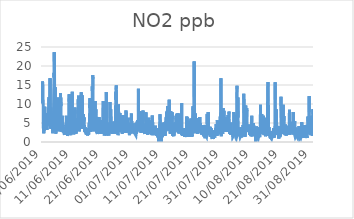
| Category | NO2 |
|---|---|
| 01/06/2019 | 15.1 |
| 01/06/2019 | 10.2 |
| 01/06/2019 | 10.1 |
| 01/06/2019 | 10.1 |
| 01/06/2019 | 15.9 |
| 01/06/2019 | 15.6 |
| 01/06/2019 | 15.8 |
| 01/06/2019 | 15 |
| 01/06/2019 | 13.9 |
| 01/06/2019 | 9.8 |
| 01/06/2019 | 4.7 |
| 01/06/2019 | 3 |
| 01/06/2019 | 3.1 |
| 01/06/2019 | 3.5 |
| 01/06/2019 | 2.3 |
| 01/06/2019 | 3.7 |
| 01/06/2019 | 3 |
| 01/06/2019 | 3.1 |
| 01/06/2019 | 4.1 |
| 01/06/2019 | 6.6 |
| 01/06/2019 | 7.6 |
| 01/06/2019 | 6.5 |
| 01/06/2019 | 9.3 |
| 01/06/2019 | 5.9 |
| 02/06/2019 | 5.3 |
| 02/06/2019 | 7.2 |
| 02/06/2019 | 6.7 |
| 02/06/2019 | 5.6 |
| 02/06/2019 | 5.7 |
| 02/06/2019 | 5.6 |
| 02/06/2019 | 5.4 |
| 02/06/2019 | 4.9 |
| 02/06/2019 | 4.8 |
| 02/06/2019 | 6.1 |
| 02/06/2019 | 7.6 |
| 02/06/2019 | 5.3 |
| 02/06/2019 | 4.1 |
| 02/06/2019 | 4.3 |
| 02/06/2019 | 4.6 |
| 02/06/2019 | 3.2 |
| 02/06/2019 | 3.7 |
| 02/06/2019 | 3.7 |
| 02/06/2019 | 3.8 |
| 02/06/2019 | 3.9 |
| 02/06/2019 | 4.5 |
| 02/06/2019 | 6.1 |
| 02/06/2019 | 5.2 |
| 02/06/2019 | 5.2 |
| 03/06/2019 | 6.2 |
| 03/06/2019 | 6.6 |
| 03/06/2019 | 7.2 |
| 03/06/2019 | 7.5 |
| 03/06/2019 | 7.7 |
| 03/06/2019 | 8.7 |
| 03/06/2019 | 8.8 |
| 03/06/2019 | 11 |
| 03/06/2019 | 11.8 |
| 03/06/2019 | 7.6 |
| 03/06/2019 | 7.6 |
| 03/06/2019 | 4.8 |
| 03/06/2019 | 5.6 |
| 03/06/2019 | 9.8 |
| 03/06/2019 | 5 |
| 03/06/2019 | 6.8 |
| 03/06/2019 | 5.8 |
| 03/06/2019 | 16.8 |
| 03/06/2019 | 8 |
| 03/06/2019 | 3.6 |
| 03/06/2019 | 4 |
| 03/06/2019 | 5.7 |
| 03/06/2019 | 5.2 |
| 03/06/2019 | 9.1 |
| 04/06/2019 | 3.5 |
| 04/06/2019 | 4.2 |
| 04/06/2019 | 6.6 |
| 04/06/2019 | 6.5 |
| 04/06/2019 | 7.6 |
| 04/06/2019 | 6.5 |
| 04/06/2019 | 6 |
| 04/06/2019 | 5.8 |
| 04/06/2019 | 4.9 |
| 04/06/2019 | 4.1 |
| 04/06/2019 | 4.2 |
| 04/06/2019 | 3.6 |
| 04/06/2019 | 4.6 |
| 04/06/2019 | 2.8 |
| 04/06/2019 | 2.3 |
| 04/06/2019 | 2.8 |
| 04/06/2019 | 2.6 |
| 04/06/2019 | 3.1 |
| 04/06/2019 | 2.7 |
| 04/06/2019 | 3.8 |
| 04/06/2019 | 5.3 |
| 04/06/2019 | 7.8 |
| 04/06/2019 | 11.2 |
| 04/06/2019 | 13.8 |
| 05/06/2019 | 14.8 |
| 05/06/2019 | 18.2 |
| 05/06/2019 | 17 |
| 05/06/2019 | 23.6 |
| 05/06/2019 | 21.1 |
| 05/06/2019 | 19.2 |
| 05/06/2019 | 12.4 |
| 05/06/2019 | 7.4 |
| 05/06/2019 | 5.9 |
| 05/06/2019 | 5.8 |
| 05/06/2019 | 4.3 |
| 05/06/2019 | 14.4 |
| 05/06/2019 | 7.2 |
| 05/06/2019 | 3 |
| 05/06/2019 | 4.4 |
| 05/06/2019 | 3.2 |
| 05/06/2019 | 2.2 |
| 05/06/2019 | 2.1 |
| 05/06/2019 | 3.5 |
| 05/06/2019 | 2.9 |
| 05/06/2019 | 4.5 |
| 05/06/2019 | 6.8 |
| 05/06/2019 | 6.2 |
| 05/06/2019 | 6.6 |
| 06/06/2019 | 6.8 |
| 06/06/2019 | 7.1 |
| 06/06/2019 | 6.1 |
| 06/06/2019 | 6.9 |
| 06/06/2019 | 10.6 |
| 06/06/2019 | 11.7 |
| 06/06/2019 | 10 |
| 06/06/2019 | 6.7 |
| 06/06/2019 | 4.2 |
| 06/06/2019 | 4.2 |
| 06/06/2019 | 4.9 |
| 06/06/2019 | 3.9 |
| 06/06/2019 | 4.3 |
| 06/06/2019 | 4.4 |
| 06/06/2019 | 3.5 |
| 06/06/2019 | 3.1 |
| 06/06/2019 | 3.1 |
| 06/06/2019 | 2.8 |
| 06/06/2019 | 2.6 |
| 06/06/2019 | 2.8 |
| 06/06/2019 | 3.7 |
| 06/06/2019 | 5 |
| 06/06/2019 | 6.8 |
| 06/06/2019 | 8.1 |
| 07/06/2019 | 7.7 |
| 07/06/2019 | 6.2 |
| 07/06/2019 | 5.2 |
| 07/06/2019 | 6.6 |
| 07/06/2019 | 7.1 |
| 07/06/2019 | 10.5 |
| 07/06/2019 | 12.9 |
| 07/06/2019 | 9.6 |
| 07/06/2019 | 11.7 |
| 07/06/2019 | 9.4 |
| 07/06/2019 | 6.7 |
| 07/06/2019 | 5.1 |
| 07/06/2019 | 4 |
| 07/06/2019 | 3.7 |
| 07/06/2019 | 3 |
| 07/06/2019 | 2.7 |
| 07/06/2019 | 3 |
| 07/06/2019 | 2.9 |
| 07/06/2019 | 3.1 |
| 07/06/2019 | 3.7 |
| 07/06/2019 | 6.9 |
| 07/06/2019 | 5.1 |
| 07/06/2019 | 4.9 |
| 07/06/2019 | 2.9 |
| 08/06/2019 | 3.3 |
| 08/06/2019 | 3.6 |
| 08/06/2019 | 3.3 |
| 08/06/2019 | 3.8 |
| 08/06/2019 | 2.9 |
| 08/06/2019 | 2.5 |
| 08/06/2019 | 2.5 |
| 08/06/2019 | 2.6 |
| 08/06/2019 | 3.7 |
| 08/06/2019 | 3.2 |
| 08/06/2019 | 2.2 |
| 08/06/2019 | 2.1 |
| 08/06/2019 | 2.3 |
| 08/06/2019 | 2.1 |
| 08/06/2019 | 1.9 |
| 08/06/2019 | 2.2 |
| 08/06/2019 | 2.3 |
| 08/06/2019 | 2.2 |
| 08/06/2019 | 2.4 |
| 08/06/2019 | 2.2 |
| 08/06/2019 | 2.1 |
| 08/06/2019 | 2.2 |
| 08/06/2019 | 3.2 |
| 08/06/2019 | 3 |
| 09/06/2019 | 4.5 |
| 09/06/2019 | 4.1 |
| 09/06/2019 | 3.9 |
| 09/06/2019 | 4.9 |
| 09/06/2019 | 6 |
| 09/06/2019 | 6.9 |
| 09/06/2019 | 6.4 |
| 09/06/2019 | 5.5 |
| 09/06/2019 | 4.1 |
| 09/06/2019 | 3.6 |
| 09/06/2019 | 2.9 |
| 09/06/2019 | 3.1 |
| 09/06/2019 | 2.7 |
| 09/06/2019 | 2.6 |
| 09/06/2019 | 2.1 |
| 09/06/2019 | 1.6 |
| 09/06/2019 | 1.7 |
| 09/06/2019 | 1.6 |
| 09/06/2019 | 1.5 |
| 09/06/2019 | 1.7 |
| 09/06/2019 | 2.5 |
| 09/06/2019 | 3.9 |
| 09/06/2019 | 6.4 |
| 09/06/2019 | 5.4 |
| 10/06/2019 | 6.3 |
| 10/06/2019 | 8.7 |
| 10/06/2019 | 11.1 |
| 10/06/2019 | 12.2 |
| 10/06/2019 | 12.6 |
| 10/06/2019 | 10.6 |
| 10/06/2019 | 11.7 |
| 10/06/2019 | 9.1 |
| 10/06/2019 | 6.6 |
| 10/06/2019 | 11 |
| 10/06/2019 | 6 |
| 10/06/2019 | 3.4 |
| 10/06/2019 | 2.5 |
| 10/06/2019 | 3.7 |
| 10/06/2019 | 2.4 |
| 10/06/2019 | 2.5 |
| 10/06/2019 | 2.1 |
| 10/06/2019 | 1.8 |
| 10/06/2019 | 1.9 |
| 10/06/2019 | 3.3 |
| 10/06/2019 | 4.9 |
| 10/06/2019 | 3.5 |
| 10/06/2019 | 3.7 |
| 10/06/2019 | 3.6 |
| 11/06/2019 | 3.7 |
| 11/06/2019 | 8.2 |
| 11/06/2019 | 8.6 |
| 11/06/2019 | 6.2 |
| 11/06/2019 | 9.3 |
| 11/06/2019 | 13.2 |
| 11/06/2019 | 8.3 |
| 11/06/2019 | 7.6 |
| 11/06/2019 | 5 |
| 11/06/2019 | 4.6 |
| 11/06/2019 | 3.7 |
| 11/06/2019 | 3.4 |
| 11/06/2019 | 2.5 |
| 11/06/2019 | 2.9 |
| 11/06/2019 | 2.8 |
| 11/06/2019 | 2.4 |
| 11/06/2019 | 2.6 |
| 11/06/2019 | 2 |
| 11/06/2019 | 2.3 |
| 11/06/2019 | 2.7 |
| 11/06/2019 | 3.3 |
| 11/06/2019 | 4.9 |
| 11/06/2019 | 5.4 |
| 11/06/2019 | 5.2 |
| 12/06/2019 | 6.1 |
| 12/06/2019 | 6.7 |
| 12/06/2019 | 6.5 |
| 12/06/2019 | 7.9 |
| 12/06/2019 | 9.1 |
| 12/06/2019 | 7.4 |
| 12/06/2019 | 6.5 |
| 12/06/2019 | 6.1 |
| 12/06/2019 | 5.9 |
| 12/06/2019 | 4.2 |
| 12/06/2019 | 2.8 |
| 12/06/2019 | 3.2 |
| 12/06/2019 | 2.2 |
| 12/06/2019 | 3.9 |
| 12/06/2019 | 2.6 |
| 12/06/2019 | 4.3 |
| 12/06/2019 | 3 |
| 12/06/2019 | 4.9 |
| 12/06/2019 | 3.7 |
| 12/06/2019 | 3.9 |
| 12/06/2019 | 4.2 |
| 12/06/2019 | 4.3 |
| 12/06/2019 | 5.3 |
| 12/06/2019 | 3.9 |
| 13/06/2019 | 4.9 |
| 13/06/2019 | 5.1 |
| 13/06/2019 | 5 |
| 13/06/2019 | 8 |
| 13/06/2019 | 9.8 |
| 13/06/2019 | 11.3 |
| 13/06/2019 | 11 |
| 13/06/2019 | 9.7 |
| 13/06/2019 | 12.2 |
| 13/06/2019 | 11.8 |
| 13/06/2019 | 6.6 |
| 13/06/2019 | 8.4 |
| 13/06/2019 | 8.2 |
| 13/06/2019 | 2.8 |
| 13/06/2019 | 2.7 |
| 13/06/2019 | 2.7 |
| 13/06/2019 | 2.6 |
| 13/06/2019 | 3.5 |
| 13/06/2019 | 3.6 |
| 13/06/2019 | 3.8 |
| 13/06/2019 | 3.9 |
| 13/06/2019 | 5.1 |
| 13/06/2019 | 6 |
| 13/06/2019 | 7.3 |
| 14/06/2019 | 3.5 |
| 14/06/2019 | 4.2 |
| 14/06/2019 | 5.5 |
| 14/06/2019 | 5.6 |
| 14/06/2019 | 7.5 |
| 14/06/2019 | 11.8 |
| 14/06/2019 | 13.1 |
| 14/06/2019 | 10.7 |
| 14/06/2019 | 7.7 |
| 14/06/2019 | 7.3 |
| 14/06/2019 | 5 |
| 14/06/2019 | 10.5 |
| 14/06/2019 | 7.1 |
| 14/06/2019 | 8.1 |
| 14/06/2019 | 12.3 |
| 14/06/2019 | 8 |
| 14/06/2019 | 5.2 |
| 14/06/2019 | 6 |
| 14/06/2019 | 6.7 |
| 14/06/2019 | 4.9 |
| 14/06/2019 | 3.4 |
| 14/06/2019 | 4.2 |
| 14/06/2019 | 3.9 |
| 14/06/2019 | 4.6 |
| 15/06/2019 | 7.3 |
| 15/06/2019 | 5.1 |
| 15/06/2019 | 6.6 |
| 15/06/2019 | 5.4 |
| 15/06/2019 | 6.4 |
| 15/06/2019 | 4.6 |
| 15/06/2019 | 3.8 |
| 15/06/2019 | 4.5 |
| 15/06/2019 | 4.2 |
| 15/06/2019 | 3 |
| 15/06/2019 | 2.6 |
| 15/06/2019 | 2.8 |
| 15/06/2019 | 3.5 |
| 15/06/2019 | 3.7 |
| 15/06/2019 | 3.9 |
| 15/06/2019 | 3.2 |
| 15/06/2019 | 3.2 |
| 15/06/2019 | 3.1 |
| 15/06/2019 | 2.9 |
| 15/06/2019 | 2.4 |
| 15/06/2019 | 2.5 |
| 15/06/2019 | 3.1 |
| 15/06/2019 | 2 |
| 15/06/2019 | 2 |
| 16/06/2019 | 3.6 |
| 16/06/2019 | 3.1 |
| 16/06/2019 | 3.1 |
| 16/06/2019 | 2 |
| 16/06/2019 | 3.2 |
| 16/06/2019 | 3.3 |
| 16/06/2019 | 3.5 |
| 16/06/2019 | 2.1 |
| 16/06/2019 | 2.1 |
| 16/06/2019 | 1.7 |
| 16/06/2019 | 1.8 |
| 16/06/2019 | 2 |
| 16/06/2019 | 2.4 |
| 16/06/2019 | 2 |
| 16/06/2019 | 2.2 |
| 16/06/2019 | 2.2 |
| 16/06/2019 | 2.1 |
| 16/06/2019 | 2.4 |
| 16/06/2019 | 2 |
| 16/06/2019 | 2.1 |
| 16/06/2019 | 2.6 |
| 16/06/2019 | 4 |
| 16/06/2019 | 4 |
| 16/06/2019 | 5.1 |
| 17/06/2019 | 3.8 |
| 17/06/2019 | 5 |
| 17/06/2019 | 7.1 |
| 17/06/2019 | 9.9 |
| 17/06/2019 | 9 |
| 17/06/2019 | 11.5 |
| 17/06/2019 | 9.5 |
| 17/06/2019 | 6.5 |
| 17/06/2019 | 5.3 |
| 17/06/2019 | 3.5 |
| 17/06/2019 | 2.8 |
| 17/06/2019 | 3.3 |
| 17/06/2019 | 3.2 |
| 17/06/2019 | 2.7 |
| 17/06/2019 | 2.6 |
| 17/06/2019 | 2.8 |
| 17/06/2019 | 4.8 |
| 17/06/2019 | 3.6 |
| 17/06/2019 | 3.3 |
| 17/06/2019 | 3.8 |
| 17/06/2019 | 3.1 |
| 17/06/2019 | 3.7 |
| 17/06/2019 | 8.6 |
| 17/06/2019 | 10.3 |
| 18/06/2019 | 14.7 |
| 18/06/2019 | 11.9 |
| 18/06/2019 | 13.5 |
| 18/06/2019 | 14.2 |
| 18/06/2019 | 17.6 |
| 18/06/2019 | 16.6 |
| 18/06/2019 | 13.7 |
| 18/06/2019 | 7.3 |
| 18/06/2019 | 6.3 |
| 18/06/2019 | 5.6 |
| 18/06/2019 | 5.6 |
| 18/06/2019 | 4.7 |
| 18/06/2019 | 3.1 |
| 18/06/2019 | 5 |
| 18/06/2019 | 4.2 |
| 18/06/2019 | 3.5 |
| 18/06/2019 | 3.4 |
| 18/06/2019 | 3.3 |
| 18/06/2019 | 3.8 |
| 18/06/2019 | 2.8 |
| 18/06/2019 | 3.1 |
| 18/06/2019 | 8.8 |
| 18/06/2019 | 9.2 |
| 18/06/2019 | 10.8 |
| 19/06/2019 | 8.3 |
| 19/06/2019 | 7 |
| 19/06/2019 | 7.3 |
| 19/06/2019 | 7.6 |
| 19/06/2019 | 8.2 |
| 19/06/2019 | 8.6 |
| 19/06/2019 | 8.4 |
| 19/06/2019 | 7.3 |
| 19/06/2019 | 6.6 |
| 19/06/2019 | 4.1 |
| 19/06/2019 | 3.8 |
| 19/06/2019 | 2.9 |
| 19/06/2019 | 2.8 |
| 19/06/2019 | 2.5 |
| 19/06/2019 | 3.8 |
| 19/06/2019 | 2.4 |
| 19/06/2019 | 2.1 |
| 19/06/2019 | 2.4 |
| 19/06/2019 | 2.1 |
| 19/06/2019 | 2.2 |
| 19/06/2019 | 4.1 |
| 19/06/2019 | 3.9 |
| 19/06/2019 | 3.8 |
| 19/06/2019 | 3.9 |
| 20/06/2019 | 5 |
| 20/06/2019 | 5.6 |
| 20/06/2019 | 5.4 |
| 20/06/2019 | 5.6 |
| 20/06/2019 | 6.6 |
| 20/06/2019 | 5 |
| 20/06/2019 | 6.5 |
| 20/06/2019 | 5.5 |
| 20/06/2019 | 4.1 |
| 20/06/2019 | 3 |
| 20/06/2019 | 2.5 |
| 20/06/2019 | 2.8 |
| 20/06/2019 | 2.6 |
| 20/06/2019 | 2.5 |
| 20/06/2019 | 3.1 |
| 20/06/2019 | 3.4 |
| 20/06/2019 | 2.1 |
| 20/06/2019 | 2.6 |
| 20/06/2019 | 4.9 |
| 20/06/2019 | 4.6 |
| 20/06/2019 | 4.7 |
| 20/06/2019 | 5.8 |
| 20/06/2019 | 4.8 |
| 20/06/2019 | 4.8 |
| 21/06/2019 | 2.8 |
| 21/06/2019 | 2.7 |
| 21/06/2019 | 3.2 |
| 21/06/2019 | 2.2 |
| 21/06/2019 | 2.5 |
| 21/06/2019 | 3 |
| 21/06/2019 | 3.2 |
| 21/06/2019 | 5.1 |
| 21/06/2019 | 4.6 |
| 21/06/2019 | 3.8 |
| 21/06/2019 | 3.2 |
| 21/06/2019 | 3.5 |
| 21/06/2019 | 3.2 |
| 21/06/2019 | 3.6 |
| 21/06/2019 | 3.8 |
| 21/06/2019 | 4.1 |
| 21/06/2019 | 10.8 |
| 21/06/2019 | 3.3 |
| 21/06/2019 | 4.2 |
| 21/06/2019 | 2.8 |
| 21/06/2019 | 3.7 |
| 21/06/2019 | 3.6 |
| 21/06/2019 | 2.5 |
| 21/06/2019 | 2.6 |
| 22/06/2019 | 2 |
| 22/06/2019 | 1.7 |
| 22/06/2019 | 1.8 |
| 22/06/2019 | 1.8 |
| 22/06/2019 | 1.7 |
| 22/06/2019 | 1.9 |
| 22/06/2019 | 1.8 |
| 22/06/2019 | 2.5 |
| 22/06/2019 | 2 |
| 22/06/2019 | 2.4 |
| 22/06/2019 | 5.6 |
| 22/06/2019 | 4.5 |
| 22/06/2019 | 3.3 |
| 22/06/2019 | 4.4 |
| 22/06/2019 | 9.2 |
| 22/06/2019 | 3.9 |
| 22/06/2019 | 10.5 |
| 22/06/2019 | 10.1 |
| 22/06/2019 | 13.1 |
| 22/06/2019 | 11.1 |
| 22/06/2019 | 1.7 |
| 22/06/2019 | 2.2 |
| 22/06/2019 | 2.2 |
| 22/06/2019 | 2.4 |
| 23/06/2019 | 2.5 |
| 23/06/2019 | 2.2 |
| 23/06/2019 | 2.1 |
| 23/06/2019 | 2.4 |
| 23/06/2019 | 2.7 |
| 23/06/2019 | 2.5 |
| 23/06/2019 | 2.3 |
| 23/06/2019 | 2.2 |
| 23/06/2019 | 2.2 |
| 23/06/2019 | 2.2 |
| 23/06/2019 | 2.2 |
| 23/06/2019 | 2.4 |
| 23/06/2019 | 2 |
| 23/06/2019 | 1.9 |
| 23/06/2019 | 1.7 |
| 23/06/2019 | 2 |
| 23/06/2019 | 3.3 |
| 23/06/2019 | 2.3 |
| 23/06/2019 | 3.1 |
| 23/06/2019 | 2.8 |
| 23/06/2019 | 4.3 |
| 23/06/2019 | 6.1 |
| 23/06/2019 | 7.2 |
| 23/06/2019 | 9.3 |
| 24/06/2019 | 10.5 |
| 24/06/2019 | 6.3 |
| 24/06/2019 | 5.2 |
| 24/06/2019 | 5 |
| 24/06/2019 | 3.8 |
| 24/06/2019 | 5.6 |
| 24/06/2019 | 8.6 |
| 24/06/2019 | 5.6 |
| 24/06/2019 | 4.5 |
| 24/06/2019 | 4.5 |
| 24/06/2019 | 4.7 |
| 24/06/2019 | 4 |
| 24/06/2019 | 3.6 |
| 24/06/2019 | 2.9 |
| 24/06/2019 | 3.7 |
| 24/06/2019 | 3.3 |
| 24/06/2019 | 2.2 |
| 24/06/2019 | 2.2 |
| 24/06/2019 | 2.8 |
| 24/06/2019 | 2.2 |
| 24/06/2019 | 2.2 |
| 24/06/2019 | 2.7 |
| 24/06/2019 | 3.2 |
| 24/06/2019 | 4 |
| 25/06/2019 | 3.2 |
| 25/06/2019 | 3.6 |
| 25/06/2019 | 2.5 |
| 25/06/2019 | 2.5 |
| 25/06/2019 | 2.6 |
| 25/06/2019 | 3.2 |
| 25/06/2019 | 5.4 |
| 25/06/2019 | 2.7 |
| 25/06/2019 | 2.9 |
| 25/06/2019 | 3 |
| 25/06/2019 | 3.1 |
| 25/06/2019 | 3.2 |
| 25/06/2019 | 2.3 |
| 25/06/2019 | 2.5 |
| 25/06/2019 | 3.8 |
| 25/06/2019 | 2.7 |
| 25/06/2019 | 2.2 |
| 25/06/2019 | 2 |
| 25/06/2019 | 2 |
| 25/06/2019 | 2.6 |
| 25/06/2019 | 2.9 |
| 25/06/2019 | 8.7 |
| 25/06/2019 | 13.2 |
| 25/06/2019 | 11.2 |
| 26/06/2019 | 12.1 |
| 26/06/2019 | 14.1 |
| 26/06/2019 | 14.9 |
| 26/06/2019 | 14 |
| 26/06/2019 | 12.9 |
| 26/06/2019 | 10.1 |
| 26/06/2019 | 9.9 |
| 26/06/2019 | 7.8 |
| 26/06/2019 | 8.5 |
| 26/06/2019 | 5.2 |
| 26/06/2019 | 3.1 |
| 26/06/2019 | 2.6 |
| 26/06/2019 | 2.5 |
| 26/06/2019 | 2.8 |
| 26/06/2019 | 2.5 |
| 26/06/2019 | 2.3 |
| 26/06/2019 | 1.8 |
| 26/06/2019 | 1.8 |
| 26/06/2019 | 2.1 |
| 26/06/2019 | 3.9 |
| 26/06/2019 | 5 |
| 26/06/2019 | 9.9 |
| 26/06/2019 | 6.3 |
| 26/06/2019 | 6.2 |
| 27/06/2019 | 5.7 |
| 27/06/2019 | 3.3 |
| 27/06/2019 | 2.6 |
| 27/06/2019 | 3 |
| 27/06/2019 | 3.9 |
| 27/06/2019 | 4.4 |
| 27/06/2019 | 6.2 |
| 27/06/2019 | 6 |
| 27/06/2019 | 7.6 |
| 27/06/2019 | 5.3 |
| 27/06/2019 | 5.6 |
| 27/06/2019 | 4.3 |
| 27/06/2019 | 6.4 |
| 27/06/2019 | 4 |
| 27/06/2019 | 4.6 |
| 27/06/2019 | 4.8 |
| 27/06/2019 | 3.9 |
| 27/06/2019 | 3.4 |
| 27/06/2019 | 2.9 |
| 27/06/2019 | 4.1 |
| 27/06/2019 | 4.1 |
| 27/06/2019 | 5.2 |
| 27/06/2019 | 3.5 |
| 27/06/2019 | 2.6 |
| 28/06/2019 | 4.4 |
| 28/06/2019 | 4.9 |
| 28/06/2019 | 4.8 |
| 28/06/2019 | 2.2 |
| 28/06/2019 | 3.1 |
| 28/06/2019 | 5.3 |
| 28/06/2019 | 6.2 |
| 28/06/2019 | 5.5 |
| 28/06/2019 | 5.4 |
| 28/06/2019 | 7.1 |
| 28/06/2019 | 3.9 |
| 28/06/2019 | 5 |
| 28/06/2019 | 4.3 |
| 28/06/2019 | 3.6 |
| 28/06/2019 | 4.1 |
| 28/06/2019 | 5.4 |
| 28/06/2019 | 4.6 |
| 28/06/2019 | 3.5 |
| 28/06/2019 | 4.3 |
| 28/06/2019 | 3.2 |
| 28/06/2019 | 4.6 |
| 28/06/2019 | 5.1 |
| 28/06/2019 | 4.2 |
| 28/06/2019 | 4.5 |
| 29/06/2019 | 6.1 |
| 29/06/2019 | 6.3 |
| 29/06/2019 | 3.3 |
| 29/06/2019 | 2.4 |
| 29/06/2019 | 2.3 |
| 29/06/2019 | 4.4 |
| 29/06/2019 | 3.9 |
| 29/06/2019 | 4.4 |
| 29/06/2019 | 3.7 |
| 29/06/2019 | 7.9 |
| 29/06/2019 | 8.3 |
| 29/06/2019 | 7.1 |
| 29/06/2019 | 7.2 |
| 29/06/2019 | 4 |
| 29/06/2019 | 4.8 |
| 29/06/2019 | 5.8 |
| 29/06/2019 | 2.7 |
| 29/06/2019 | 3.1 |
| 29/06/2019 | 3 |
| 29/06/2019 | 2.5 |
| 29/06/2019 | 2.4 |
| 29/06/2019 | 3.1 |
| 29/06/2019 | 5.3 |
| 29/06/2019 | 5 |
| 30/06/2019 | 5.8 |
| 30/06/2019 | 5.7 |
| 30/06/2019 | 6.1 |
| 30/06/2019 | 6.4 |
| 30/06/2019 | 5.7 |
| 30/06/2019 | 4.9 |
| 30/06/2019 | 2.7 |
| 30/06/2019 | 2.6 |
| 30/06/2019 | 2.6 |
| 30/06/2019 | 3.2 |
| 30/06/2019 | 2.6 |
| 30/06/2019 | 2.2 |
| 30/06/2019 | 2 |
| 30/06/2019 | 2 |
| 30/06/2019 | 1.8 |
| 30/06/2019 | 1.6 |
| 30/06/2019 | 2.4 |
| 30/06/2019 | 2.2 |
| 30/06/2019 | 2.1 |
| 30/06/2019 | 3.6 |
| 30/06/2019 | 4.3 |
| 30/06/2019 | 4.5 |
| 30/06/2019 | 4.5 |
| 30/06/2019 | 3.3 |
| 01/07/2019 | 4.1 |
| 01/07/2019 | 3.3 |
| 01/07/2019 | 3.5 |
| 01/07/2019 | 4.3 |
| 01/07/2019 | 4.8 |
| 01/07/2019 | 7.5 |
| 01/07/2019 | 5.8 |
| 01/07/2019 | 5 |
| 01/07/2019 | 5.5 |
| 01/07/2019 | 4.1 |
| 01/07/2019 | 2.8 |
| 01/07/2019 | 2.4 |
| 01/07/2019 | 2.3 |
| 01/07/2019 | 3.2 |
| 01/07/2019 | 4.2 |
| 01/07/2019 | 4.2 |
| 01/07/2019 | 2.9 |
| 01/07/2019 | 2.4 |
| 01/07/2019 | 2.6 |
| 01/07/2019 | 3.4 |
| 01/07/2019 | 4.9 |
| 01/07/2019 | 2.9 |
| 01/07/2019 | 2.3 |
| 01/07/2019 | 2.2 |
| 02/07/2019 | 2.9 |
| 02/07/2019 | 3.6 |
| 02/07/2019 | 3.4 |
| 02/07/2019 | 3.5 |
| 02/07/2019 | 2.8 |
| 02/07/2019 | 2.1 |
| 02/07/2019 | 2.1 |
| 02/07/2019 | 3.8 |
| 02/07/2019 | 2.4 |
| 02/07/2019 | 2.2 |
| 02/07/2019 | 2.3 |
| 02/07/2019 | 2.1 |
| 02/07/2019 | 1.9 |
| 02/07/2019 | 1.9 |
| 02/07/2019 | 2 |
| 02/07/2019 | 2.1 |
| 02/07/2019 | 1.9 |
| 02/07/2019 | 1.9 |
| 02/07/2019 | 1.7 |
| 02/07/2019 | 2 |
| 02/07/2019 | 2.3 |
| 02/07/2019 | 5.1 |
| 02/07/2019 | 4.3 |
| 02/07/2019 | 2.2 |
| 03/07/2019 | 2.1 |
| 03/07/2019 | 2.9 |
| 03/07/2019 | 4.7 |
| 03/07/2019 | 3.9 |
| 03/07/2019 | 3.2 |
| 03/07/2019 | 3 |
| 03/07/2019 | 5.8 |
| 03/07/2019 | 4.8 |
| 03/07/2019 | 4.8 |
| 03/07/2019 | 3.9 |
| 03/07/2019 | 3 |
| 03/07/2019 | 3.5 |
| 03/07/2019 | 2.8 |
| 03/07/2019 | 4.9 |
| 03/07/2019 | 14 |
| 03/07/2019 | 5.4 |
| 03/07/2019 | 4.9 |
| 03/07/2019 | 4.5 |
| 03/07/2019 | 7.7 |
| 03/07/2019 | 3.1 |
| 03/07/2019 | 3.2 |
| 03/07/2019 | 4 |
| 03/07/2019 | 3.1 |
| 03/07/2019 | 4 |
| 04/07/2019 | 4.2 |
| 04/07/2019 | 3.9 |
| 04/07/2019 | 3.6 |
| 04/07/2019 | 3 |
| 04/07/2019 | 4 |
| 04/07/2019 | 7 |
| 04/07/2019 | 8.1 |
| 04/07/2019 | 5.5 |
| 04/07/2019 | 4.6 |
| 04/07/2019 | 5.1 |
| 04/07/2019 | 3.5 |
| 04/07/2019 | 2.4 |
| 04/07/2019 | 2.6 |
| 04/07/2019 | 3.5 |
| 04/07/2019 | 2.7 |
| 04/07/2019 | 3.3 |
| 04/07/2019 | 3.6 |
| 04/07/2019 | 4.3 |
| 04/07/2019 | 6 |
| 04/07/2019 | 3.2 |
| 04/07/2019 | 4.3 |
| 04/07/2019 | 5.3 |
| 04/07/2019 | 4 |
| 04/07/2019 | 5.2 |
| 05/07/2019 | 7.1 |
| 05/07/2019 | 5.9 |
| 05/07/2019 | 5.4 |
| 05/07/2019 | 6.2 |
| 05/07/2019 | 8.3 |
| 05/07/2019 | 7.7 |
| 05/07/2019 | 5.2 |
| 05/07/2019 | 5.3 |
| 05/07/2019 | 4.1 |
| 05/07/2019 | 3.2 |
| 05/07/2019 | 2.5 |
| 05/07/2019 | 2.7 |
| 05/07/2019 | 2.9 |
| 05/07/2019 | 3.1 |
| 05/07/2019 | 3 |
| 05/07/2019 | 2.4 |
| 05/07/2019 | 2.3 |
| 05/07/2019 | 2.7 |
| 05/07/2019 | 2.7 |
| 05/07/2019 | 2.1 |
| 05/07/2019 | 2.1 |
| 05/07/2019 | 3.1 |
| 05/07/2019 | 2.7 |
| 05/07/2019 | 4.6 |
| 06/07/2019 | 4.6 |
| 06/07/2019 | 2.8 |
| 06/07/2019 | 3.4 |
| 06/07/2019 | 7.1 |
| 06/07/2019 | 7.8 |
| 06/07/2019 | 5.2 |
| 06/07/2019 | 5.2 |
| 06/07/2019 | 5.3 |
| 06/07/2019 | 3.9 |
| 06/07/2019 | 2.8 |
| 06/07/2019 | 2.8 |
| 06/07/2019 | 2.5 |
| 06/07/2019 | 2.8 |
| 06/07/2019 | 2.9 |
| 06/07/2019 | 2.8 |
| 06/07/2019 | 2.7 |
| 06/07/2019 | 2.5 |
| 06/07/2019 | 2.5 |
| 06/07/2019 | 1.9 |
| 06/07/2019 | 1.7 |
| 06/07/2019 | 3.8 |
| 06/07/2019 | 3.6 |
| 06/07/2019 | 5 |
| 06/07/2019 | 4.9 |
| 07/07/2019 | 4.6 |
| 07/07/2019 | 4.2 |
| 07/07/2019 | 6.4 |
| 07/07/2019 | 5 |
| 07/07/2019 | 5 |
| 07/07/2019 | 5.1 |
| 07/07/2019 | 4.5 |
| 07/07/2019 | 5.7 |
| 07/07/2019 | 3.5 |
| 07/07/2019 | 3.1 |
| 07/07/2019 | 2.7 |
| 07/07/2019 | 2.7 |
| 07/07/2019 | 2.6 |
| 07/07/2019 | 2.6 |
| 07/07/2019 | 2.7 |
| 07/07/2019 | 2.4 |
| 07/07/2019 | 2.1 |
| 07/07/2019 | 2.3 |
| 07/07/2019 | 2.3 |
| 07/07/2019 | 3 |
| 07/07/2019 | 3.8 |
| 07/07/2019 | 3.9 |
| 07/07/2019 | 3.2 |
| 07/07/2019 | 3 |
| 08/07/2019 | 4.4 |
| 08/07/2019 | 3.9 |
| 08/07/2019 | 2.3 |
| 08/07/2019 | 1.8 |
| 08/07/2019 | 2.4 |
| 08/07/2019 | 4.6 |
| 08/07/2019 | 5 |
| 08/07/2019 | 7 |
| 08/07/2019 | 5.3 |
| 08/07/2019 | 6 |
| 08/07/2019 | 4.5 |
| 08/07/2019 | 4.5 |
| 08/07/2019 | 3.2 |
| 08/07/2019 | 3.2 |
| 08/07/2019 | 3 |
| 08/07/2019 | 3 |
| 08/07/2019 | 2.7 |
| 08/07/2019 | 2.9 |
| 08/07/2019 | 1.8 |
| 08/07/2019 | 2.2 |
| 08/07/2019 | 3 |
| 08/07/2019 | 2.8 |
| 08/07/2019 | 2.5 |
| 08/07/2019 | 2.5 |
| 09/07/2019 | 3.8 |
| 09/07/2019 | 2.3 |
| 09/07/2019 | 2.4 |
| 09/07/2019 | 2.4 |
| 09/07/2019 | 2.6 |
| 09/07/2019 | 2.6 |
| 09/07/2019 | 3.3 |
| 09/07/2019 | 4 |
| 09/07/2019 | 3.5 |
| 09/07/2019 | 4.3 |
| 09/07/2019 | 1.9 |
| 09/07/2019 | 3.6 |
| 09/07/2019 | 3 |
| 09/07/2019 | 2.8 |
| 09/07/2019 | 3 |
| 09/07/2019 | 2.3 |
| 09/07/2019 | 2 |
| 09/07/2019 | 3.1 |
| 09/07/2019 | 2 |
| 09/07/2019 | 1.6 |
| 09/07/2019 | 1.4 |
| 09/07/2019 | 1.7 |
| 09/07/2019 | 1.5 |
| 09/07/2019 | 3.6 |
| 10/07/2019 | 1.6 |
| 10/07/2019 | 2.3 |
| 10/07/2019 | 1.7 |
| 10/07/2019 | 1.2 |
| 10/07/2019 | 1.4 |
| 10/07/2019 | 2.2 |
| 10/07/2019 | 2.8 |
| 10/07/2019 | 2.4 |
| 10/07/2019 | 2.2 |
| 10/07/2019 | 1.9 |
| 10/07/2019 | 0 |
| 10/07/2019 | 0 |
| 10/07/2019 | 0 |
| 10/07/2019 | 0 |
| 10/07/2019 | 0 |
| 10/07/2019 | 0 |
| 10/07/2019 | 0 |
| 10/07/2019 | 2.8 |
| 10/07/2019 | 3 |
| 10/07/2019 | 2.3 |
| 10/07/2019 | 4.6 |
| 10/07/2019 | 6.6 |
| 10/07/2019 | 7.3 |
| 10/07/2019 | 3.8 |
| 11/07/2019 | 4.7 |
| 11/07/2019 | 4 |
| 11/07/2019 | 4.7 |
| 11/07/2019 | 5 |
| 11/07/2019 | 3.6 |
| 11/07/2019 | 3.3 |
| 11/07/2019 | 2.9 |
| 11/07/2019 | 3.4 |
| 11/07/2019 | 0 |
| 11/07/2019 | 0 |
| 11/07/2019 | 0 |
| 11/07/2019 | 0 |
| 11/07/2019 | 0 |
| 11/07/2019 | 3.4 |
| 11/07/2019 | 2.4 |
| 11/07/2019 | 2 |
| 11/07/2019 | 1.6 |
| 11/07/2019 | 1.3 |
| 11/07/2019 | 1.6 |
| 11/07/2019 | 1.7 |
| 11/07/2019 | 2.1 |
| 11/07/2019 | 4.9 |
| 11/07/2019 | 2.9 |
| 11/07/2019 | 2.3 |
| 12/07/2019 | 2.1 |
| 12/07/2019 | 1.9 |
| 12/07/2019 | 2 |
| 12/07/2019 | 5.1 |
| 12/07/2019 | 2.9 |
| 12/07/2019 | 3.3 |
| 12/07/2019 | 4.7 |
| 12/07/2019 | 2.8 |
| 12/07/2019 | 3.3 |
| 12/07/2019 | 3.7 |
| 12/07/2019 | 3.1 |
| 12/07/2019 | 2.4 |
| 12/07/2019 | 2.2 |
| 12/07/2019 | 1.7 |
| 12/07/2019 | 2 |
| 12/07/2019 | 1.9 |
| 12/07/2019 | 1.7 |
| 12/07/2019 | 1.6 |
| 12/07/2019 | 2.9 |
| 12/07/2019 | 2.4 |
| 12/07/2019 | 5.5 |
| 12/07/2019 | 5.4 |
| 12/07/2019 | 5.4 |
| 12/07/2019 | 5.5 |
| 13/07/2019 | 6.6 |
| 13/07/2019 | 5.9 |
| 13/07/2019 | 6.2 |
| 13/07/2019 | 7.7 |
| 13/07/2019 | 6.4 |
| 13/07/2019 | 3.8 |
| 13/07/2019 | 8 |
| 13/07/2019 | 5.6 |
| 13/07/2019 | 5.8 |
| 13/07/2019 | 7.8 |
| 13/07/2019 | 9.5 |
| 13/07/2019 | 5 |
| 13/07/2019 | 3.3 |
| 13/07/2019 | 3.1 |
| 13/07/2019 | 3 |
| 13/07/2019 | 4.8 |
| 13/07/2019 | 8.8 |
| 13/07/2019 | 3.8 |
| 13/07/2019 | 5 |
| 13/07/2019 | 4.1 |
| 13/07/2019 | 4.4 |
| 13/07/2019 | 6.5 |
| 13/07/2019 | 5.4 |
| 13/07/2019 | 4.7 |
| 14/07/2019 | 11.1 |
| 14/07/2019 | 3.7 |
| 14/07/2019 | 3.3 |
| 14/07/2019 | 3 |
| 14/07/2019 | 3.8 |
| 14/07/2019 | 7 |
| 14/07/2019 | 6.5 |
| 14/07/2019 | 4.1 |
| 14/07/2019 | 5 |
| 14/07/2019 | 2.2 |
| 14/07/2019 | 2 |
| 14/07/2019 | 7.6 |
| 14/07/2019 | 2.9 |
| 14/07/2019 | 8.1 |
| 14/07/2019 | 5.7 |
| 14/07/2019 | 4.9 |
| 14/07/2019 | 2.5 |
| 14/07/2019 | 5.1 |
| 14/07/2019 | 3.5 |
| 14/07/2019 | 4 |
| 14/07/2019 | 5.8 |
| 14/07/2019 | 7 |
| 14/07/2019 | 6.1 |
| 14/07/2019 | 6.9 |
| 15/07/2019 | 7.8 |
| 15/07/2019 | 7.6 |
| 15/07/2019 | 1.7 |
| 15/07/2019 | 1.7 |
| 15/07/2019 | 1.7 |
| 15/07/2019 | 1.9 |
| 15/07/2019 | 2.8 |
| 15/07/2019 | 1.9 |
| 15/07/2019 | 2.1 |
| 15/07/2019 | 2.1 |
| 15/07/2019 | 2 |
| 15/07/2019 | 2.1 |
| 15/07/2019 | 1.5 |
| 15/07/2019 | 2.4 |
| 15/07/2019 | 1.7 |
| 15/07/2019 | 1.9 |
| 15/07/2019 | 1.9 |
| 15/07/2019 | 4 |
| 15/07/2019 | 3 |
| 15/07/2019 | 2.5 |
| 15/07/2019 | 4.2 |
| 15/07/2019 | 5.1 |
| 15/07/2019 | 2.6 |
| 15/07/2019 | 3.6 |
| 16/07/2019 | 3.8 |
| 16/07/2019 | 4.4 |
| 16/07/2019 | 4.5 |
| 16/07/2019 | 4.9 |
| 16/07/2019 | 4.9 |
| 16/07/2019 | 5.3 |
| 16/07/2019 | 5.5 |
| 16/07/2019 | 6.9 |
| 16/07/2019 | 6 |
| 16/07/2019 | 5.2 |
| 16/07/2019 | 4.5 |
| 16/07/2019 | 6 |
| 16/07/2019 | 5 |
| 16/07/2019 | 3.9 |
| 16/07/2019 | 3.9 |
| 16/07/2019 | 3.2 |
| 16/07/2019 | 7.3 |
| 16/07/2019 | 5.3 |
| 16/07/2019 | 7.5 |
| 16/07/2019 | 5.6 |
| 16/07/2019 | 5.4 |
| 16/07/2019 | 3.5 |
| 16/07/2019 | 3 |
| 16/07/2019 | 3.8 |
| 17/07/2019 | 3.8 |
| 17/07/2019 | 2.6 |
| 17/07/2019 | 2.9 |
| 17/07/2019 | 2.3 |
| 17/07/2019 | 3.3 |
| 17/07/2019 | 7.2 |
| 17/07/2019 | 7.5 |
| 17/07/2019 | 7.4 |
| 17/07/2019 | 3.6 |
| 17/07/2019 | 2.9 |
| 17/07/2019 | 2.9 |
| 17/07/2019 | 2.7 |
| 17/07/2019 | 2.3 |
| 17/07/2019 | 2.9 |
| 17/07/2019 | 2.4 |
| 17/07/2019 | 4.4 |
| 17/07/2019 | 2.7 |
| 17/07/2019 | 2.3 |
| 17/07/2019 | 2.1 |
| 17/07/2019 | 2.1 |
| 17/07/2019 | 3.8 |
| 17/07/2019 | 2.8 |
| 17/07/2019 | 4.2 |
| 17/07/2019 | 6 |
| 18/07/2019 | 7.1 |
| 18/07/2019 | 5.2 |
| 18/07/2019 | 5.5 |
| 18/07/2019 | 4.1 |
| 18/07/2019 | 6.9 |
| 18/07/2019 | 10.2 |
| 18/07/2019 | 2.8 |
| 18/07/2019 | 1.8 |
| 18/07/2019 | 2 |
| 18/07/2019 | 2.4 |
| 18/07/2019 | 1.8 |
| 18/07/2019 | 2.6 |
| 18/07/2019 | 1.6 |
| 18/07/2019 | 1.4 |
| 18/07/2019 | 3.6 |
| 18/07/2019 | 2 |
| 18/07/2019 | 2.2 |
| 18/07/2019 | 2.8 |
| 18/07/2019 | 2.1 |
| 18/07/2019 | 1.8 |
| 18/07/2019 | 2.9 |
| 18/07/2019 | 3 |
| 18/07/2019 | 2 |
| 18/07/2019 | 2.5 |
| 19/07/2019 | 2.1 |
| 19/07/2019 | 2 |
| 19/07/2019 | 1.6 |
| 19/07/2019 | 1.4 |
| 19/07/2019 | 1.5 |
| 19/07/2019 | 2.1 |
| 19/07/2019 | 2.9 |
| 19/07/2019 | 1.3 |
| 19/07/2019 | 1.4 |
| 19/07/2019 | 2 |
| 19/07/2019 | 1.8 |
| 19/07/2019 | 1.4 |
| 19/07/2019 | 1.7 |
| 19/07/2019 | 3.7 |
| 19/07/2019 | 2.3 |
| 19/07/2019 | 1.9 |
| 19/07/2019 | 2.5 |
| 19/07/2019 | 1.4 |
| 19/07/2019 | 1.2 |
| 19/07/2019 | 1.3 |
| 19/07/2019 | 3.1 |
| 19/07/2019 | 5.6 |
| 19/07/2019 | 6.7 |
| 19/07/2019 | 3.1 |
| 20/07/2019 | 6.6 |
| 20/07/2019 | 6.4 |
| 20/07/2019 | 3 |
| 20/07/2019 | 1.8 |
| 20/07/2019 | 1.8 |
| 20/07/2019 | 4.7 |
| 20/07/2019 | 3.4 |
| 20/07/2019 | 1.8 |
| 20/07/2019 | 1.4 |
| 20/07/2019 | 1.3 |
| 20/07/2019 | 1.3 |
| 20/07/2019 | 1.4 |
| 20/07/2019 | 3.3 |
| 20/07/2019 | 1.8 |
| 20/07/2019 | 1.5 |
| 20/07/2019 | 1.5 |
| 20/07/2019 | 1.5 |
| 20/07/2019 | 1.5 |
| 20/07/2019 | 1.8 |
| 20/07/2019 | 1.4 |
| 20/07/2019 | 2.5 |
| 20/07/2019 | 5.6 |
| 20/07/2019 | 4 |
| 20/07/2019 | 2.2 |
| 21/07/2019 | 3.1 |
| 21/07/2019 | 3.4 |
| 21/07/2019 | 3.9 |
| 21/07/2019 | 2.4 |
| 21/07/2019 | 3.3 |
| 21/07/2019 | 4 |
| 21/07/2019 | 3.5 |
| 21/07/2019 | 4.6 |
| 21/07/2019 | 6.2 |
| 21/07/2019 | 5.6 |
| 21/07/2019 | 4.4 |
| 21/07/2019 | 4.8 |
| 21/07/2019 | 2.1 |
| 21/07/2019 | 2.3 |
| 21/07/2019 | 1.4 |
| 21/07/2019 | 1.3 |
| 21/07/2019 | 1.3 |
| 21/07/2019 | 1.2 |
| 21/07/2019 | 1.8 |
| 21/07/2019 | 1.5 |
| 21/07/2019 | 2.8 |
| 21/07/2019 | 4.6 |
| 21/07/2019 | 4.8 |
| 21/07/2019 | 5.5 |
| 22/07/2019 | 5.2 |
| 22/07/2019 | 8.9 |
| 22/07/2019 | 9.4 |
| 22/07/2019 | 6.2 |
| 22/07/2019 | 6.9 |
| 22/07/2019 | 7.7 |
| 22/07/2019 | 8 |
| 22/07/2019 | 7.8 |
| 22/07/2019 | 6.9 |
| 22/07/2019 | 8.5 |
| 22/07/2019 | 3.9 |
| 22/07/2019 | 21.2 |
| 22/07/2019 | 11.9 |
| 22/07/2019 | 11 |
| 22/07/2019 | 7.3 |
| 22/07/2019 | 3.3 |
| 22/07/2019 | 2.3 |
| 22/07/2019 | 2.1 |
| 22/07/2019 | 3.7 |
| 22/07/2019 | 3.8 |
| 22/07/2019 | 4.8 |
| 22/07/2019 | 6.4 |
| 22/07/2019 | 7.5 |
| 22/07/2019 | 3.5 |
| 23/07/2019 | 3.6 |
| 23/07/2019 | 3 |
| 23/07/2019 | 3.2 |
| 23/07/2019 | 4.4 |
| 23/07/2019 | 2.9 |
| 23/07/2019 | 6.2 |
| 23/07/2019 | 6.1 |
| 23/07/2019 | 6 |
| 23/07/2019 | 5.6 |
| 23/07/2019 | 6.1 |
| 23/07/2019 | 3 |
| 23/07/2019 | 3.2 |
| 23/07/2019 | 2.5 |
| 23/07/2019 | 3 |
| 23/07/2019 | 2.1 |
| 23/07/2019 | 3 |
| 23/07/2019 | 3.3 |
| 23/07/2019 | 3.1 |
| 23/07/2019 | 2.3 |
| 23/07/2019 | 2.6 |
| 23/07/2019 | 3.2 |
| 23/07/2019 | 4.1 |
| 23/07/2019 | 3.2 |
| 23/07/2019 | 3.3 |
| 24/07/2019 | 2.9 |
| 24/07/2019 | 3.6 |
| 24/07/2019 | 4.2 |
| 24/07/2019 | 3.8 |
| 24/07/2019 | 3.5 |
| 24/07/2019 | 5 |
| 24/07/2019 | 6.2 |
| 24/07/2019 | 4.1 |
| 24/07/2019 | 6.6 |
| 24/07/2019 | 4.3 |
| 24/07/2019 | 2.8 |
| 24/07/2019 | 4.6 |
| 24/07/2019 | 3.1 |
| 24/07/2019 | 5 |
| 24/07/2019 | 4.1 |
| 24/07/2019 | 2.9 |
| 24/07/2019 | 3.5 |
| 24/07/2019 | 3.8 |
| 24/07/2019 | 2.8 |
| 24/07/2019 | 2.5 |
| 24/07/2019 | 3.1 |
| 24/07/2019 | 2.8 |
| 24/07/2019 | 2.6 |
| 24/07/2019 | 2 |
| 25/07/2019 | 4.1 |
| 25/07/2019 | 3.7 |
| 25/07/2019 | 3.1 |
| 25/07/2019 | 2.9 |
| 25/07/2019 | 2.3 |
| 25/07/2019 | 2 |
| 25/07/2019 | 3.5 |
| 25/07/2019 | 4.5 |
| 25/07/2019 | 2.7 |
| 25/07/2019 | 2.7 |
| 25/07/2019 | 3.2 |
| 25/07/2019 | 3.8 |
| 25/07/2019 | 2.3 |
| 25/07/2019 | 1.8 |
| 25/07/2019 | 1.6 |
| 25/07/2019 | 1.8 |
| 25/07/2019 | 2.1 |
| 25/07/2019 | 1.5 |
| 25/07/2019 | 2.6 |
| 25/07/2019 | 2.2 |
| 25/07/2019 | 2.2 |
| 25/07/2019 | 2.3 |
| 25/07/2019 | 3 |
| 25/07/2019 | 1.8 |
| 26/07/2019 | 1.6 |
| 26/07/2019 | 2 |
| 26/07/2019 | 1.3 |
| 26/07/2019 | 1 |
| 26/07/2019 | 1 |
| 26/07/2019 | 1.2 |
| 26/07/2019 | 4.5 |
| 26/07/2019 | 1.9 |
| 26/07/2019 | 1.8 |
| 26/07/2019 | 1.8 |
| 26/07/2019 | 1.7 |
| 26/07/2019 | 1.9 |
| 26/07/2019 | 1.9 |
| 26/07/2019 | 2.1 |
| 26/07/2019 | 1.7 |
| 26/07/2019 | 1.4 |
| 26/07/2019 | 1.8 |
| 26/07/2019 | 1.4 |
| 26/07/2019 | 1.8 |
| 26/07/2019 | 4.5 |
| 26/07/2019 | 7.4 |
| 26/07/2019 | 7.4 |
| 26/07/2019 | 4.8 |
| 26/07/2019 | 3.7 |
| 27/07/2019 | 2.7 |
| 27/07/2019 | 3.1 |
| 27/07/2019 | 3.2 |
| 27/07/2019 | 6.4 |
| 27/07/2019 | 4.9 |
| 27/07/2019 | 7.9 |
| 27/07/2019 | 7.7 |
| 27/07/2019 | 4.9 |
| 27/07/2019 | 4.2 |
| 27/07/2019 | 3.6 |
| 27/07/2019 | 2.7 |
| 27/07/2019 | 2.1 |
| 27/07/2019 | 2 |
| 27/07/2019 | 1.8 |
| 27/07/2019 | 2.2 |
| 27/07/2019 | 2.3 |
| 27/07/2019 | 1.9 |
| 27/07/2019 | 2.2 |
| 27/07/2019 | 2.7 |
| 27/07/2019 | 3.1 |
| 27/07/2019 | 3.2 |
| 27/07/2019 | 4 |
| 27/07/2019 | 3.5 |
| 27/07/2019 | 3.3 |
| 28/07/2019 | 2.3 |
| 28/07/2019 | 1.3 |
| 28/07/2019 | 3 |
| 28/07/2019 | 1.6 |
| 28/07/2019 | 3.7 |
| 28/07/2019 | 2 |
| 28/07/2019 | 1.6 |
| 28/07/2019 | 1.4 |
| 28/07/2019 | 1.4 |
| 28/07/2019 | 1.2 |
| 28/07/2019 | 1.1 |
| 28/07/2019 | 1 |
| 28/07/2019 | 1.2 |
| 28/07/2019 | 0.8 |
| 28/07/2019 | 1 |
| 28/07/2019 | 1 |
| 28/07/2019 | 1 |
| 28/07/2019 | 1 |
| 28/07/2019 | 1.9 |
| 28/07/2019 | 1 |
| 28/07/2019 | 1.7 |
| 28/07/2019 | 1.6 |
| 28/07/2019 | 1.1 |
| 28/07/2019 | 0.8 |
| 29/07/2019 | 0.7 |
| 29/07/2019 | 0.6 |
| 29/07/2019 | 0.6 |
| 29/07/2019 | 3.1 |
| 29/07/2019 | 1.6 |
| 29/07/2019 | 2.1 |
| 29/07/2019 | 2.7 |
| 29/07/2019 | 2.6 |
| 29/07/2019 | 2.1 |
| 29/07/2019 | 1.2 |
| 29/07/2019 | 1.1 |
| 29/07/2019 | 1.5 |
| 29/07/2019 | 1.5 |
| 29/07/2019 | 1.3 |
| 29/07/2019 | 1.5 |
| 29/07/2019 | 1.7 |
| 29/07/2019 | 1.5 |
| 29/07/2019 | 3.7 |
| 29/07/2019 | 2.8 |
| 29/07/2019 | 2.8 |
| 29/07/2019 | 3.8 |
| 29/07/2019 | 4.7 |
| 29/07/2019 | 4.1 |
| 29/07/2019 | 3.5 |
| 30/07/2019 | 2.9 |
| 30/07/2019 | 1.8 |
| 30/07/2019 | 4 |
| 30/07/2019 | 2.9 |
| 30/07/2019 | 1.6 |
| 30/07/2019 | 2.5 |
| 30/07/2019 | 4.2 |
| 30/07/2019 | 5.7 |
| 30/07/2019 | 4.1 |
| 30/07/2019 | 3.5 |
| 30/07/2019 | 2.9 |
| 30/07/2019 | 3.5 |
| 30/07/2019 | 2.6 |
| 30/07/2019 | 3 |
| 30/07/2019 | 2.7 |
| 30/07/2019 | 2 |
| 30/07/2019 | 2.5 |
| 30/07/2019 | 3.1 |
| 30/07/2019 | 2.2 |
| 30/07/2019 | 3.1 |
| 30/07/2019 | 2.2 |
| 30/07/2019 | 2.4 |
| 30/07/2019 | 2 |
| 30/07/2019 | 2.4 |
| 31/07/2019 | 2.8 |
| 31/07/2019 | 4.8 |
| 31/07/2019 | 3.2 |
| 31/07/2019 | 2.7 |
| 31/07/2019 | 2.9 |
| 31/07/2019 | 4.6 |
| 31/07/2019 | 6.7 |
| 31/07/2019 | 4.4 |
| 31/07/2019 | 3.8 |
| 31/07/2019 | 7.2 |
| 31/07/2019 | 3.9 |
| 31/07/2019 | 7.8 |
| 31/07/2019 | 16.8 |
| 31/07/2019 | 4.4 |
| 31/07/2019 | 2.4 |
| 31/07/2019 | 1.5 |
| 31/07/2019 | 2.9 |
| 31/07/2019 | 2.4 |
| 31/07/2019 | 2.1 |
| 31/07/2019 | 2.7 |
| 31/07/2019 | 3.3 |
| 31/07/2019 | 3.6 |
| 31/07/2019 | 3.8 |
| 31/07/2019 | 3.8 |
| 01/08/2019 | 7.8 |
| 01/08/2019 | 2.8 |
| 01/08/2019 | 2.1 |
| 01/08/2019 | 2.8 |
| 01/08/2019 | 2.7 |
| 01/08/2019 | 5.8 |
| 01/08/2019 | 8.9 |
| 01/08/2019 | 8.6 |
| 01/08/2019 | 5.2 |
| 01/08/2019 | 6.5 |
| 01/08/2019 | 5.4 |
| 01/08/2019 | 5.5 |
| 01/08/2019 | 6.6 |
| 01/08/2019 | 8.2 |
| 01/08/2019 | 3.5 |
| 01/08/2019 | 3.7 |
| 01/08/2019 | 3.3 |
| 01/08/2019 | 2.7 |
| 01/08/2019 | 2.5 |
| 01/08/2019 | 3.3 |
| 01/08/2019 | 4 |
| 01/08/2019 | 4.1 |
| 01/08/2019 | 3.6 |
| 01/08/2019 | 6.6 |
| 02/08/2019 | 5.2 |
| 02/08/2019 | 4 |
| 02/08/2019 | 3.4 |
| 02/08/2019 | 3.7 |
| 02/08/2019 | 3.2 |
| 02/08/2019 | 3.8 |
| 02/08/2019 | 6.3 |
| 02/08/2019 | 5.2 |
| 02/08/2019 | 6.2 |
| 02/08/2019 | 4.4 |
| 02/08/2019 | 4.5 |
| 02/08/2019 | 4.5 |
| 02/08/2019 | 2.7 |
| 02/08/2019 | 3.9 |
| 02/08/2019 | 2.7 |
| 02/08/2019 | 2.7 |
| 02/08/2019 | 3.2 |
| 02/08/2019 | 2.7 |
| 02/08/2019 | 3.7 |
| 02/08/2019 | 3.3 |
| 02/08/2019 | 4.1 |
| 02/08/2019 | 4.8 |
| 02/08/2019 | 7.1 |
| 02/08/2019 | 5.3 |
| 03/08/2019 | 5.9 |
| 03/08/2019 | 5.9 |
| 03/08/2019 | 5 |
| 03/08/2019 | 4.3 |
| 03/08/2019 | 4.7 |
| 03/08/2019 | 8 |
| 03/08/2019 | 7.4 |
| 03/08/2019 | 4.9 |
| 03/08/2019 | 3.6 |
| 03/08/2019 | 3.3 |
| 03/08/2019 | 3 |
| 03/08/2019 | 2.1 |
| 03/08/2019 | 2.4 |
| 03/08/2019 | 3.5 |
| 03/08/2019 | 4.5 |
| 03/08/2019 | 2.3 |
| 03/08/2019 | 3.5 |
| 03/08/2019 | 4.7 |
| 03/08/2019 | 2.5 |
| 03/08/2019 | 1.9 |
| 03/08/2019 | 2.6 |
| 03/08/2019 | 5.1 |
| 03/08/2019 | 2.9 |
| 03/08/2019 | 2.4 |
| 04/08/2019 | 2 |
| 04/08/2019 | 2 |
| 04/08/2019 | 2 |
| 04/08/2019 | 1.9 |
| 04/08/2019 | 3.1 |
| 04/08/2019 | 2.4 |
| 04/08/2019 | 2.1 |
| 04/08/2019 | 2.5 |
| 04/08/2019 | 1.9 |
| 04/08/2019 | 2.4 |
| 04/08/2019 | 1.9 |
| 04/08/2019 | 2.2 |
| 04/08/2019 | 1.3 |
| 04/08/2019 | 1.3 |
| 04/08/2019 | 1.3 |
| 04/08/2019 | 1.2 |
| 04/08/2019 | 1.2 |
| 04/08/2019 | 1.6 |
| 04/08/2019 | 1.6 |
| 04/08/2019 | 2.4 |
| 04/08/2019 | 7 |
| 04/08/2019 | 7.9 |
| 04/08/2019 | 3.8 |
| 04/08/2019 | 3.2 |
| 05/08/2019 | 4.5 |
| 05/08/2019 | 5.2 |
| 05/08/2019 | 3.2 |
| 05/08/2019 | 3.1 |
| 05/08/2019 | 3.7 |
| 05/08/2019 | 4.6 |
| 05/08/2019 | 3.9 |
| 05/08/2019 | 2.9 |
| 05/08/2019 | 2 |
| 05/08/2019 | 3.3 |
| 05/08/2019 | 1.9 |
| 05/08/2019 | 1.7 |
| 05/08/2019 | 1.2 |
| 05/08/2019 | 1.2 |
| 05/08/2019 | 1.1 |
| 05/08/2019 | 1 |
| 05/08/2019 | 0.9 |
| 05/08/2019 | 0.9 |
| 05/08/2019 | 1.2 |
| 05/08/2019 | 4.8 |
| 05/08/2019 | 10.1 |
| 05/08/2019 | 11.7 |
| 05/08/2019 | 14.8 |
| 05/08/2019 | 13.9 |
| 06/08/2019 | 8.9 |
| 06/08/2019 | 5.7 |
| 06/08/2019 | 4.1 |
| 06/08/2019 | 10.3 |
| 06/08/2019 | 6.4 |
| 06/08/2019 | 11.1 |
| 06/08/2019 | 11.7 |
| 06/08/2019 | 6.6 |
| 06/08/2019 | 4.9 |
| 06/08/2019 | 4 |
| 06/08/2019 | 2.6 |
| 06/08/2019 | 2 |
| 06/08/2019 | 3.4 |
| 06/08/2019 | 1.9 |
| 06/08/2019 | 1.5 |
| 06/08/2019 | 1.9 |
| 06/08/2019 | 1.6 |
| 06/08/2019 | 1.6 |
| 06/08/2019 | 3.8 |
| 06/08/2019 | 2.4 |
| 06/08/2019 | 2.1 |
| 06/08/2019 | 2.3 |
| 06/08/2019 | 1.7 |
| 06/08/2019 | 1.5 |
| 07/08/2019 | 1.3 |
| 07/08/2019 | 1.3 |
| 07/08/2019 | 1.3 |
| 07/08/2019 | 1.3 |
| 07/08/2019 | 1.2 |
| 07/08/2019 | 1.7 |
| 07/08/2019 | 2.2 |
| 07/08/2019 | 2.3 |
| 07/08/2019 | 2.3 |
| 07/08/2019 | 2 |
| 07/08/2019 | 1.6 |
| 07/08/2019 | 1.2 |
| 07/08/2019 | 1.8 |
| 07/08/2019 | 1.3 |
| 07/08/2019 | 1.5 |
| 07/08/2019 | 1.2 |
| 07/08/2019 | 1.4 |
| 07/08/2019 | 3.9 |
| 07/08/2019 | 2.2 |
| 07/08/2019 | 2.1 |
| 07/08/2019 | 3.3 |
| 07/08/2019 | 3.3 |
| 07/08/2019 | 3.6 |
| 07/08/2019 | 4.5 |
| 08/08/2019 | 4.6 |
| 08/08/2019 | 4.5 |
| 08/08/2019 | 3.3 |
| 08/08/2019 | 2.7 |
| 08/08/2019 | 3.3 |
| 08/08/2019 | 3.6 |
| 08/08/2019 | 12.7 |
| 08/08/2019 | 7.6 |
| 08/08/2019 | 4.1 |
| 08/08/2019 | 3.1 |
| 08/08/2019 | 1.7 |
| 08/08/2019 | 1.5 |
| 08/08/2019 | 1.9 |
| 08/08/2019 | 1.8 |
| 08/08/2019 | 2.2 |
| 08/08/2019 | 2.8 |
| 08/08/2019 | 1.4 |
| 08/08/2019 | 1.6 |
| 08/08/2019 | 1.6 |
| 08/08/2019 | 4 |
| 08/08/2019 | 8.2 |
| 08/08/2019 | 8.9 |
| 08/08/2019 | 9.6 |
| 08/08/2019 | 5.7 |
| 09/08/2019 | 5.8 |
| 09/08/2019 | 8 |
| 09/08/2019 | 4.3 |
| 09/08/2019 | 4.2 |
| 09/08/2019 | 5.7 |
| 09/08/2019 | 5.9 |
| 09/08/2019 | 8.9 |
| 09/08/2019 | 8.1 |
| 09/08/2019 | 5.1 |
| 09/08/2019 | 3.8 |
| 09/08/2019 | 4.2 |
| 09/08/2019 | 3.1 |
| 09/08/2019 | 3.6 |
| 09/08/2019 | 4.1 |
| 09/08/2019 | 4.5 |
| 09/08/2019 | 4.5 |
| 09/08/2019 | 3.3 |
| 09/08/2019 | 2.6 |
| 09/08/2019 | 2.9 |
| 09/08/2019 | 2.8 |
| 09/08/2019 | 3.6 |
| 09/08/2019 | 4 |
| 09/08/2019 | 4.6 |
| 09/08/2019 | 4.6 |
| 10/08/2019 | 3.4 |
| 10/08/2019 | 3.5 |
| 10/08/2019 | 4.1 |
| 10/08/2019 | 3.4 |
| 10/08/2019 | 1.9 |
| 10/08/2019 | 1.7 |
| 10/08/2019 | 2.2 |
| 10/08/2019 | 3.2 |
| 10/08/2019 | 3.8 |
| 10/08/2019 | 2.9 |
| 10/08/2019 | 2.2 |
| 10/08/2019 | 2.3 |
| 10/08/2019 | 2 |
| 10/08/2019 | 1.7 |
| 10/08/2019 | 4.4 |
| 10/08/2019 | 2.2 |
| 10/08/2019 | 2.5 |
| 10/08/2019 | 2.9 |
| 10/08/2019 | 1.5 |
| 10/08/2019 | 2.1 |
| 10/08/2019 | 2.8 |
| 10/08/2019 | 4.9 |
| 10/08/2019 | 6.9 |
| 10/08/2019 | 3.9 |
| 11/08/2019 | 4.6 |
| 11/08/2019 | 3.8 |
| 11/08/2019 | 4 |
| 11/08/2019 | 2 |
| 11/08/2019 | 1.8 |
| 11/08/2019 | 1.5 |
| 11/08/2019 | 3.1 |
| 11/08/2019 | 3.2 |
| 11/08/2019 | 2.3 |
| 11/08/2019 | 1.7 |
| 11/08/2019 | 1.5 |
| 11/08/2019 | 2 |
| 11/08/2019 | 3 |
| 11/08/2019 | 5 |
| 11/08/2019 | 3.7 |
| 11/08/2019 | 3.4 |
| 11/08/2019 | 3.2 |
| 11/08/2019 | 2.7 |
| 11/08/2019 | 2 |
| 11/08/2019 | 1.8 |
| 11/08/2019 | 2.4 |
| 11/08/2019 | 3.1 |
| 11/08/2019 | 1.8 |
| 11/08/2019 | 2.6 |
| 12/08/2019 | 1.8 |
| 12/08/2019 | 2.1 |
| 12/08/2019 | 2.3 |
| 12/08/2019 | 3 |
| 12/08/2019 | 1.6 |
| 12/08/2019 | 1.3 |
| 12/08/2019 | 0 |
| 12/08/2019 | 3.4 |
| 12/08/2019 | 2.3 |
| 12/08/2019 | 3.3 |
| 12/08/2019 | 3.3 |
| 12/08/2019 | 2.4 |
| 12/08/2019 | 4.1 |
| 12/08/2019 | 2.9 |
| 12/08/2019 | 3.2 |
| 12/08/2019 | 2 |
| 12/08/2019 | 2 |
| 12/08/2019 | 2.6 |
| 12/08/2019 | 1.8 |
| 12/08/2019 | 1.4 |
| 12/08/2019 | 1.1 |
| 12/08/2019 | 0.9 |
| 12/08/2019 | 1.1 |
| 12/08/2019 | 0.9 |
| 13/08/2019 | 1.1 |
| 13/08/2019 | 0.9 |
| 13/08/2019 | 0.8 |
| 13/08/2019 | 1 |
| 13/08/2019 | 1.1 |
| 13/08/2019 | 1.1 |
| 13/08/2019 | 1.4 |
| 13/08/2019 | 2.1 |
| 13/08/2019 | 1.7 |
| 13/08/2019 | 1.8 |
| 13/08/2019 | 1.8 |
| 13/08/2019 | 3.9 |
| 13/08/2019 | 2 |
| 13/08/2019 | 1.6 |
| 13/08/2019 | 1.3 |
| 13/08/2019 | 1.3 |
| 13/08/2019 | 1.3 |
| 13/08/2019 | 1.7 |
| 13/08/2019 | 1.8 |
| 13/08/2019 | 2.1 |
| 13/08/2019 | 6.4 |
| 13/08/2019 | 9.8 |
| 13/08/2019 | 8.2 |
| 13/08/2019 | 5.1 |
| 14/08/2019 | 2.7 |
| 14/08/2019 | 2.1 |
| 14/08/2019 | 2.6 |
| 14/08/2019 | 2.5 |
| 14/08/2019 | 3.2 |
| 14/08/2019 | 5.4 |
| 14/08/2019 | 4.2 |
| 14/08/2019 | 7.3 |
| 14/08/2019 | 4 |
| 14/08/2019 | 2.7 |
| 14/08/2019 | 5.3 |
| 14/08/2019 | 2.6 |
| 14/08/2019 | 2.1 |
| 14/08/2019 | 3.8 |
| 14/08/2019 | 5.2 |
| 14/08/2019 | 3.8 |
| 14/08/2019 | 3.6 |
| 14/08/2019 | 4.5 |
| 14/08/2019 | 3.3 |
| 14/08/2019 | 2.7 |
| 14/08/2019 | 3.2 |
| 14/08/2019 | 6.9 |
| 14/08/2019 | 5.5 |
| 14/08/2019 | 3 |
| 15/08/2019 | 2.5 |
| 15/08/2019 | 1.8 |
| 15/08/2019 | 1.8 |
| 15/08/2019 | 1.8 |
| 15/08/2019 | 2.3 |
| 15/08/2019 | 2.8 |
| 15/08/2019 | 3.4 |
| 15/08/2019 | 2.9 |
| 15/08/2019 | 2.8 |
| 15/08/2019 | 4.6 |
| 15/08/2019 | 3.1 |
| 15/08/2019 | 3 |
| 15/08/2019 | 2.2 |
| 15/08/2019 | 1.8 |
| 15/08/2019 | 1.5 |
| 15/08/2019 | 1.8 |
| 15/08/2019 | 1.9 |
| 15/08/2019 | 2 |
| 15/08/2019 | 2.1 |
| 15/08/2019 | 2.4 |
| 15/08/2019 | 6.4 |
| 15/08/2019 | 4.5 |
| 15/08/2019 | 4 |
| 15/08/2019 | 3.4 |
| 16/08/2019 | 2.7 |
| 16/08/2019 | 2.4 |
| 16/08/2019 | 2.2 |
| 16/08/2019 | 2.2 |
| 16/08/2019 | 3.1 |
| 16/08/2019 | 5.7 |
| 16/08/2019 | 7 |
| 16/08/2019 | 7.1 |
| 16/08/2019 | 13.8 |
| 16/08/2019 | 14.4 |
| 16/08/2019 | 15.8 |
| 16/08/2019 | 6.3 |
| 16/08/2019 | 2.7 |
| 16/08/2019 | 9.7 |
| 16/08/2019 | 2.8 |
| 16/08/2019 | 2.2 |
| 16/08/2019 | 1.6 |
| 16/08/2019 | 1.8 |
| 16/08/2019 | 3.9 |
| 16/08/2019 | 2.8 |
| 16/08/2019 | 2.3 |
| 16/08/2019 | 1.9 |
| 16/08/2019 | 1.7 |
| 16/08/2019 | 1.6 |
| 17/08/2019 | 1.4 |
| 17/08/2019 | 1.3 |
| 17/08/2019 | 1.2 |
| 17/08/2019 | 1.3 |
| 17/08/2019 | 1.2 |
| 17/08/2019 | 1.2 |
| 17/08/2019 | 1 |
| 17/08/2019 | 2.8 |
| 17/08/2019 | 1.5 |
| 17/08/2019 | 1.1 |
| 17/08/2019 | 1 |
| 17/08/2019 | 1.1 |
| 17/08/2019 | 1 |
| 17/08/2019 | 0.9 |
| 17/08/2019 | 1 |
| 17/08/2019 | 0.8 |
| 17/08/2019 | 0.9 |
| 17/08/2019 | 0.9 |
| 17/08/2019 | 0.8 |
| 17/08/2019 | 1 |
| 17/08/2019 | 1.4 |
| 17/08/2019 | 1.8 |
| 17/08/2019 | 2.1 |
| 17/08/2019 | 1.8 |
| 18/08/2019 | 1.4 |
| 18/08/2019 | 1.5 |
| 18/08/2019 | 1.1 |
| 18/08/2019 | 1.4 |
| 18/08/2019 | 1.5 |
| 18/08/2019 | 1.9 |
| 18/08/2019 | 3.7 |
| 18/08/2019 | 2.1 |
| 18/08/2019 | 1.8 |
| 18/08/2019 | 1.7 |
| 18/08/2019 | 1.4 |
| 18/08/2019 | 1.4 |
| 18/08/2019 | 1.9 |
| 18/08/2019 | 1.2 |
| 18/08/2019 | 1.2 |
| 18/08/2019 | 1.5 |
| 18/08/2019 | 1.3 |
| 18/08/2019 | 2.9 |
| 18/08/2019 | 2.1 |
| 18/08/2019 | 4.2 |
| 18/08/2019 | 15.7 |
| 18/08/2019 | 11.1 |
| 18/08/2019 | 2.9 |
| 18/08/2019 | 2.9 |
| 19/08/2019 | 1.9 |
| 19/08/2019 | 4 |
| 19/08/2019 | 3 |
| 19/08/2019 | 3.1 |
| 19/08/2019 | 2.1 |
| 19/08/2019 | 4.9 |
| 19/08/2019 | 8.6 |
| 19/08/2019 | 5.4 |
| 19/08/2019 | 5.4 |
| 19/08/2019 | 5.5 |
| 19/08/2019 | 4.7 |
| 19/08/2019 | 2.3 |
| 19/08/2019 | 3.1 |
| 19/08/2019 | 2.4 |
| 19/08/2019 | 3.1 |
| 19/08/2019 | 4.2 |
| 19/08/2019 | 3.1 |
| 19/08/2019 | 1.9 |
| 19/08/2019 | 1.8 |
| 19/08/2019 | 2.2 |
| 19/08/2019 | 4 |
| 19/08/2019 | 2.2 |
| 19/08/2019 | 1.9 |
| 19/08/2019 | 1.2 |
| 20/08/2019 | 1.9 |
| 20/08/2019 | 0.9 |
| 20/08/2019 | 0.8 |
| 20/08/2019 | 1.1 |
| 20/08/2019 | 3.2 |
| 20/08/2019 | 2.2 |
| 20/08/2019 | 4.1 |
| 20/08/2019 | 3 |
| 20/08/2019 | 2.4 |
| 20/08/2019 | 1.3 |
| 20/08/2019 | 1.3 |
| 20/08/2019 | 1.3 |
| 20/08/2019 | 1.2 |
| 20/08/2019 | 1.2 |
| 20/08/2019 | 1.1 |
| 20/08/2019 | 1.3 |
| 20/08/2019 | 1.3 |
| 20/08/2019 | 1.4 |
| 20/08/2019 | 2 |
| 20/08/2019 | 4.3 |
| 20/08/2019 | 11.9 |
| 20/08/2019 | 8.2 |
| 20/08/2019 | 6.8 |
| 20/08/2019 | 6.2 |
| 21/08/2019 | 5.1 |
| 21/08/2019 | 2.8 |
| 21/08/2019 | 3 |
| 21/08/2019 | 5.2 |
| 21/08/2019 | 4.3 |
| 21/08/2019 | 6.3 |
| 21/08/2019 | 7.8 |
| 21/08/2019 | 6.2 |
| 21/08/2019 | 6.3 |
| 21/08/2019 | 3.6 |
| 21/08/2019 | 3.3 |
| 21/08/2019 | 2.1 |
| 21/08/2019 | 3 |
| 21/08/2019 | 4 |
| 21/08/2019 | 9.8 |
| 21/08/2019 | 4.7 |
| 21/08/2019 | 2.9 |
| 21/08/2019 | 4.1 |
| 21/08/2019 | 3.4 |
| 21/08/2019 | 6.8 |
| 21/08/2019 | 5.6 |
| 21/08/2019 | 2.9 |
| 21/08/2019 | 2.1 |
| 21/08/2019 | 3.7 |
| 22/08/2019 | 2.8 |
| 22/08/2019 | 2.9 |
| 22/08/2019 | 3.8 |
| 22/08/2019 | 2.4 |
| 22/08/2019 | 1.8 |
| 22/08/2019 | 2 |
| 22/08/2019 | 2.8 |
| 22/08/2019 | 3.8 |
| 22/08/2019 | 4.6 |
| 22/08/2019 | 4.8 |
| 22/08/2019 | 4.5 |
| 22/08/2019 | 2.8 |
| 22/08/2019 | 2.1 |
| 22/08/2019 | 3.2 |
| 22/08/2019 | 1.7 |
| 22/08/2019 | 1.7 |
| 22/08/2019 | 2.4 |
| 22/08/2019 | 2.1 |
| 22/08/2019 | 2.3 |
| 22/08/2019 | 2 |
| 22/08/2019 | 3.8 |
| 22/08/2019 | 2.7 |
| 22/08/2019 | 1.9 |
| 22/08/2019 | 1.9 |
| 23/08/2019 | 2.3 |
| 23/08/2019 | 3.5 |
| 23/08/2019 | 2.8 |
| 23/08/2019 | 3.2 |
| 23/08/2019 | 2.7 |
| 23/08/2019 | 3.2 |
| 23/08/2019 | 4.3 |
| 23/08/2019 | 2.7 |
| 23/08/2019 | 3.6 |
| 23/08/2019 | 3 |
| 23/08/2019 | 2.8 |
| 23/08/2019 | 3.5 |
| 23/08/2019 | 3 |
| 23/08/2019 | 2.7 |
| 23/08/2019 | 4.3 |
| 23/08/2019 | 6.1 |
| 23/08/2019 | 8.5 |
| 23/08/2019 | 2.3 |
| 23/08/2019 | 1.9 |
| 23/08/2019 | 2.3 |
| 23/08/2019 | 2.3 |
| 23/08/2019 | 3.3 |
| 23/08/2019 | 2.9 |
| 23/08/2019 | 3.9 |
| 24/08/2019 | 5.1 |
| 24/08/2019 | 4 |
| 24/08/2019 | 4.1 |
| 24/08/2019 | 3.7 |
| 24/08/2019 | 3.7 |
| 24/08/2019 | 3.3 |
| 24/08/2019 | 4.6 |
| 24/08/2019 | 3.8 |
| 24/08/2019 | 4.5 |
| 24/08/2019 | 5.3 |
| 24/08/2019 | 4.5 |
| 24/08/2019 | 3.7 |
| 24/08/2019 | 2.6 |
| 24/08/2019 | 5 |
| 24/08/2019 | 2.3 |
| 24/08/2019 | 2.1 |
| 24/08/2019 | 2.7 |
| 24/08/2019 | 2.8 |
| 24/08/2019 | 2.4 |
| 24/08/2019 | 2.4 |
| 24/08/2019 | 4.2 |
| 24/08/2019 | 2.5 |
| 24/08/2019 | 2 |
| 24/08/2019 | 7.9 |
| 25/08/2019 | 4.6 |
| 25/08/2019 | 2.8 |
| 25/08/2019 | 2.6 |
| 25/08/2019 | 2.4 |
| 25/08/2019 | 2.1 |
| 25/08/2019 | 2.5 |
| 25/08/2019 | 3.5 |
| 25/08/2019 | 5.3 |
| 25/08/2019 | 3.3 |
| 25/08/2019 | 4.4 |
| 25/08/2019 | 4.6 |
| 25/08/2019 | 5.5 |
| 25/08/2019 | 1.8 |
| 25/08/2019 | 1.6 |
| 25/08/2019 | 1.5 |
| 25/08/2019 | 1.3 |
| 25/08/2019 | 1.2 |
| 25/08/2019 | 1.1 |
| 25/08/2019 | 1.2 |
| 25/08/2019 | 1.2 |
| 25/08/2019 | 1.4 |
| 25/08/2019 | 1.5 |
| 25/08/2019 | 3.8 |
| 25/08/2019 | 2.1 |
| 26/08/2019 | 1.7 |
| 26/08/2019 | 1.5 |
| 26/08/2019 | 1.5 |
| 26/08/2019 | 1.5 |
| 26/08/2019 | 1.6 |
| 26/08/2019 | 1.4 |
| 26/08/2019 | 1.7 |
| 26/08/2019 | 1.5 |
| 26/08/2019 | 1.6 |
| 26/08/2019 | 1.5 |
| 26/08/2019 | 1.6 |
| 26/08/2019 | 1.8 |
| 26/08/2019 | 1.3 |
| 26/08/2019 | 1 |
| 26/08/2019 | 1.2 |
| 26/08/2019 | 1.2 |
| 26/08/2019 | 1.5 |
| 26/08/2019 | 1.6 |
| 26/08/2019 | 1.1 |
| 26/08/2019 | 1 |
| 26/08/2019 | 1.6 |
| 26/08/2019 | 4.2 |
| 26/08/2019 | 1.8 |
| 26/08/2019 | 1.4 |
| 27/08/2019 | 1.2 |
| 27/08/2019 | 1 |
| 27/08/2019 | 0.9 |
| 27/08/2019 | 0.8 |
| 27/08/2019 | 0.8 |
| 27/08/2019 | 1 |
| 27/08/2019 | 1.2 |
| 27/08/2019 | 1.2 |
| 27/08/2019 | 1.5 |
| 27/08/2019 | 1.3 |
| 27/08/2019 | 1.3 |
| 27/08/2019 | 1.3 |
| 27/08/2019 | 1.4 |
| 27/08/2019 | 1.1 |
| 27/08/2019 | 1.2 |
| 27/08/2019 | 1.3 |
| 27/08/2019 | 1.4 |
| 27/08/2019 | 1.4 |
| 27/08/2019 | 1.8 |
| 27/08/2019 | 1.2 |
| 27/08/2019 | 5.2 |
| 27/08/2019 | 5.4 |
| 27/08/2019 | 2.1 |
| 27/08/2019 | 1.5 |
| 28/08/2019 | 1.5 |
| 28/08/2019 | 1.3 |
| 28/08/2019 | 1.1 |
| 28/08/2019 | 1.1 |
| 28/08/2019 | 2 |
| 28/08/2019 | 2.4 |
| 28/08/2019 | 3.2 |
| 28/08/2019 | 2.6 |
| 28/08/2019 | 2.2 |
| 28/08/2019 | 2.6 |
| 28/08/2019 | 2.3 |
| 28/08/2019 | 1.7 |
| 28/08/2019 | 1.8 |
| 28/08/2019 | 2 |
| 28/08/2019 | 2 |
| 28/08/2019 | 2.5 |
| 28/08/2019 | 2.4 |
| 28/08/2019 | 2.7 |
| 28/08/2019 | 1.5 |
| 28/08/2019 | 4.5 |
| 28/08/2019 | 3.4 |
| 28/08/2019 | 2.2 |
| 28/08/2019 | 1.9 |
| 28/08/2019 | 4.3 |
| 29/08/2019 | 1.1 |
| 29/08/2019 | 1 |
| 29/08/2019 | 1 |
| 29/08/2019 | 1 |
| 29/08/2019 | 1 |
| 29/08/2019 | 1.1 |
| 29/08/2019 | 1.8 |
| 29/08/2019 | 1.8 |
| 29/08/2019 | 1.5 |
| 29/08/2019 | 1.4 |
| 29/08/2019 | 1.5 |
| 29/08/2019 | 1.6 |
| 29/08/2019 | 1.5 |
| 29/08/2019 | 1.1 |
| 29/08/2019 | 1.4 |
| 29/08/2019 | 1.1 |
| 29/08/2019 | 1.2 |
| 29/08/2019 | 1.5 |
| 29/08/2019 | 3.9 |
| 29/08/2019 | 3.9 |
| 29/08/2019 | 4.7 |
| 29/08/2019 | 5.9 |
| 29/08/2019 | 6.7 |
| 29/08/2019 | 5.6 |
| 30/08/2019 | 5.1 |
| 30/08/2019 | 4 |
| 30/08/2019 | 2.5 |
| 30/08/2019 | 2.6 |
| 30/08/2019 | 4.2 |
| 30/08/2019 | 5.6 |
| 30/08/2019 | 6.4 |
| 30/08/2019 | 9.7 |
| 30/08/2019 | 12.1 |
| 30/08/2019 | 7.8 |
| 30/08/2019 | 4.4 |
| 30/08/2019 | 6.2 |
| 30/08/2019 | 3.2 |
| 30/08/2019 | 2 |
| 30/08/2019 | 2.8 |
| 30/08/2019 | 5.8 |
| 30/08/2019 | 5.5 |
| 30/08/2019 | 5.5 |
| 30/08/2019 | 4.9 |
| 30/08/2019 | 5.5 |
| 30/08/2019 | 5.2 |
| 30/08/2019 | 6.5 |
| 30/08/2019 | 3.9 |
| 30/08/2019 | 2.8 |
| 31/08/2019 | 1.8 |
| 31/08/2019 | 3.9 |
| 31/08/2019 | 3.9 |
| 31/08/2019 | 4.6 |
| 31/08/2019 | 6.9 |
| 31/08/2019 | 6.8 |
| 31/08/2019 | 6.3 |
| 31/08/2019 | 4.7 |
| 31/08/2019 | 4 |
| 31/08/2019 | 3.8 |
| 31/08/2019 | 2.8 |
| 31/08/2019 | 2.5 |
| 31/08/2019 | 2 |
| 31/08/2019 | 1.6 |
| 31/08/2019 | 1.7 |
| 31/08/2019 | 1.8 |
| 31/08/2019 | 8.6 |
| 31/08/2019 | 5.6 |
| 31/08/2019 | 2.7 |
| 31/08/2019 | 3.2 |
| 31/08/2019 | 3.3 |
| 31/08/2019 | 3.8 |
| 31/08/2019 | 5 |
| 31/08/2019 | 5.5 |